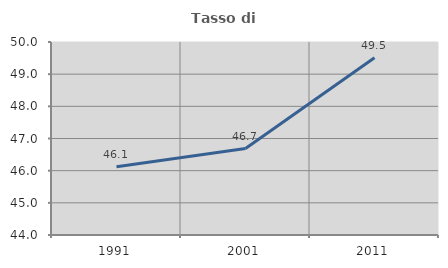
| Category | Tasso di occupazione   |
|---|---|
| 1991.0 | 46.125 |
| 2001.0 | 46.687 |
| 2011.0 | 49.508 |